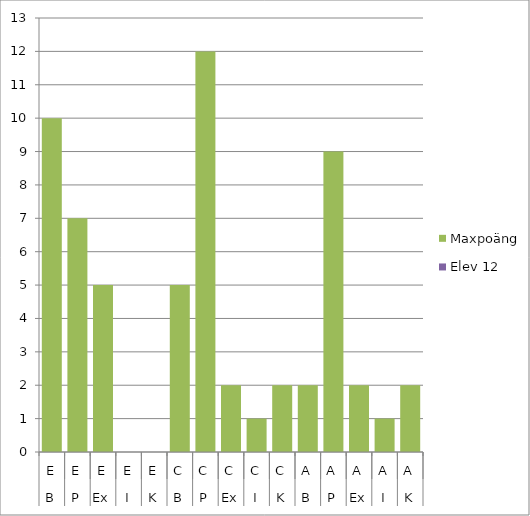
| Category | Maxpoäng | Elev 12 |
|---|---|---|
| 0 | 10 | 0 |
| 1 | 7 | 0 |
| 2 | 5 | 0 |
| 3 | 0 | 0 |
| 4 | 0 | 0 |
| 5 | 5 | 0 |
| 6 | 12 | 0 |
| 7 | 2 | 0 |
| 8 | 1 | 0 |
| 9 | 2 | 0 |
| 10 | 2 | 0 |
| 11 | 9 | 0 |
| 12 | 2 | 0 |
| 13 | 1 | 0 |
| 14 | 2 | 0 |